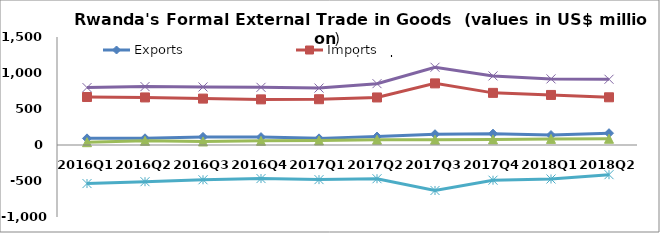
| Category | Exports | Imports | Re-Exports | Total Trade | Trade Balance |
|---|---|---|---|---|---|
| 2016Q1 | 92.097 | 666.431 | 38.936 | 797.464 | -535.397 |
| 2016Q2 | 93.292 | 660.603 | 57.563 | 811.457 | -509.748 |
| 2016Q3 | 112.41 | 644.459 | 49.15 | 806.019 | -482.9 |
| 2016Q4 | 109.497 | 633.547 | 57.935 | 800.978 | -466.115 |
| 2017Q1 | 92.022 | 635.792 | 63.008 | 790.823 | -480.761 |
| 2017Q2 | 117.438 | 660.301 | 74.393 | 852.132 | -468.47 |
| 2017Q3 | 149.648 | 855.748 | 74.341 | 1079.737 | -631.759 |
| 2017Q4 | 157.625 | 724.154 | 77.699 | 959.478 | -488.83 |
| 2018Q1 | 138.148 | 695.167 | 84.902 | 918.217 | -472.118 |
| 2018Q2 | 164.034 | 662.549 | 86.48 | 913.063 | -412.035 |